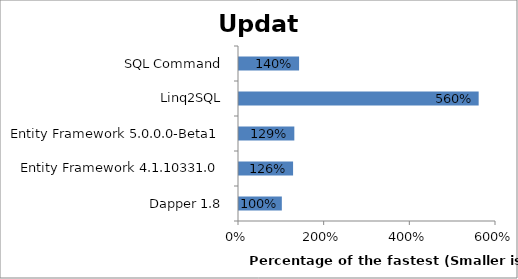
| Category | Series 0 |
|---|---|
| Dapper 1.8 | 1 |
| Entity Framework 4.1.10331.0 | 1.262 |
| Entity Framework 5.0.0.0-Beta1 | 1.292 |
| Linq2SQL | 5.595 |
| SQL Command | 1.403 |